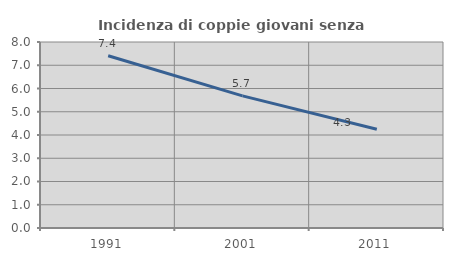
| Category | Incidenza di coppie giovani senza figli |
|---|---|
| 1991.0 | 7.407 |
| 2001.0 | 5.682 |
| 2011.0 | 4.25 |